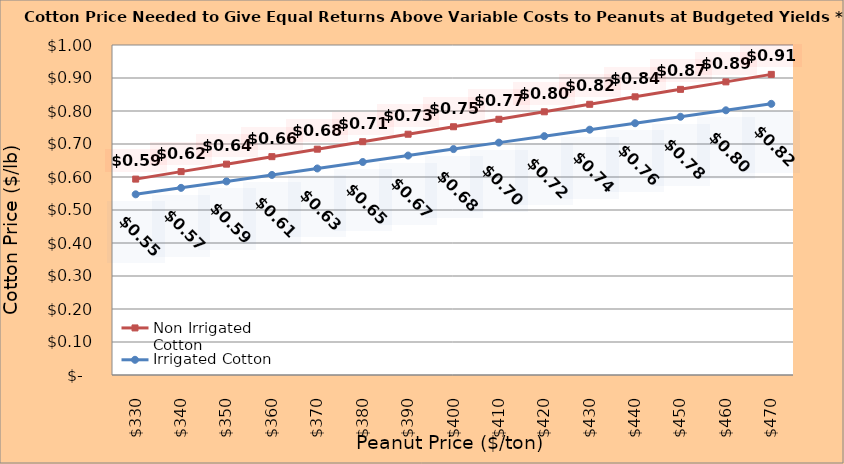
| Category | Non Irrigated Cotton | Irrigated Cotton |
|---|---|---|
| 330.0 | 0.594 | 0.548 |
| 340.0 | 0.616 | 0.567 |
| 350.0 | 0.639 | 0.587 |
| 360.0 | 0.662 | 0.606 |
| 370.0 | 0.684 | 0.626 |
| 380.0 | 0.707 | 0.645 |
| 390.0 | 0.73 | 0.665 |
| 400.0 | 0.752 | 0.685 |
| 410.0 | 0.775 | 0.704 |
| 420.0 | 0.798 | 0.724 |
| 430.0 | 0.82 | 0.743 |
| 440.0 | 0.843 | 0.763 |
| 450.0 | 0.866 | 0.783 |
| 460.0 | 0.888 | 0.802 |
| 470.0 | 0.911 | 0.822 |